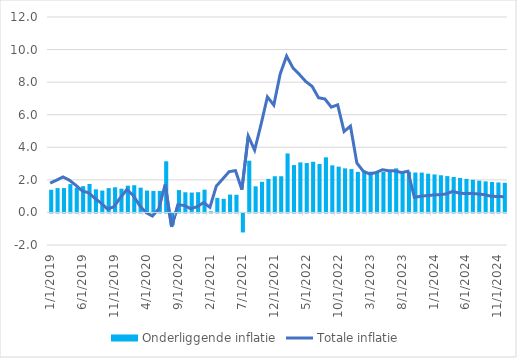
| Category | Onderliggende inflatie |
|---|---|
| 1/1/19 | 1.392 |
| 2/1/19 | 1.493 |
| 3/1/19 | 1.495 |
| 4/1/19 | 1.74 |
| 5/1/19 | 1.518 |
| 6/1/19 | 1.612 |
| 7/1/19 | 1.747 |
| 8/1/19 | 1.42 |
| 9/1/19 | 1.343 |
| 10/1/19 | 1.493 |
| 11/1/19 | 1.543 |
| 12/1/19 | 1.459 |
| 1/1/20 | 1.643 |
| 2/1/20 | 1.669 |
| 3/1/20 | 1.52 |
| 4/1/20 | 1.344 |
| 5/1/20 | 1.317 |
| 6/1/20 | 1.324 |
| 7/1/20 | 3.141 |
| 8/1/20 | -0.728 |
| 9/1/20 | 1.372 |
| 10/1/20 | 1.237 |
| 11/1/20 | 1.22 |
| 12/1/20 | 1.242 |
| 1/1/21 | 1.398 |
| 2/1/21 | 0.065 |
| 3/1/21 | 0.893 |
| 4/1/21 | 0.835 |
| 5/1/21 | 1.095 |
| 6/1/21 | 1.084 |
| 7/1/21 | -1.168 |
| 8/1/21 | 3.177 |
| 9/1/21 | 1.604 |
| 10/1/21 | 1.879 |
| 11/1/21 | 2.057 |
| 12/1/21 | 2.223 |
| 1/1/22 | 2.223 |
| 2/1/22 | 3.622 |
| 3/1/22 | 2.908 |
| 4/1/22 | 3.073 |
| 5/1/22 | 3.032 |
| 6/1/22 | 3.111 |
| 7/1/22 | 2.976 |
| 8/1/22 | 3.382 |
| 9/1/22 | 2.892 |
| 10/1/22 | 2.808 |
| 11/1/22 | 2.705 |
| 12/1/22 | 2.662 |
| 1/1/23 | 2.491 |
| 2/1/23 | 2.484 |
| 3/1/23 | 2.502 |
| 4/1/23 | 2.47 |
| 5/1/23 | 2.488 |
| 6/1/23 | 2.493 |
| 7/1/23 | 2.705 |
| 8/1/23 | 2.424 |
| 9/1/23 | 2.493 |
| 10/1/23 | 2.451 |
| 11/1/23 | 2.445 |
| 12/1/23 | 2.377 |
| 1/1/24 | 2.332 |
| 2/1/24 | 2.282 |
| 3/1/24 | 2.23 |
| 4/1/24 | 2.175 |
| 5/1/24 | 2.12 |
| 6/1/24 | 2.061 |
| 7/1/24 | 2.005 |
| 8/1/24 | 1.953 |
| 9/1/24 | 1.908 |
| 10/1/24 | 1.87 |
| 11/1/24 | 1.841 |
| 12/1/24 | 1.818 |